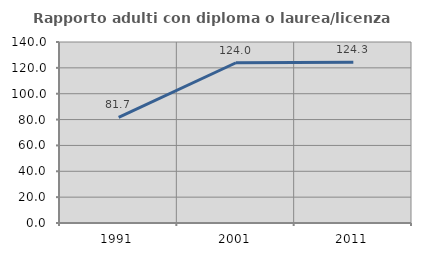
| Category | Rapporto adulti con diploma o laurea/licenza media  |
|---|---|
| 1991.0 | 81.67 |
| 2001.0 | 123.958 |
| 2011.0 | 124.331 |